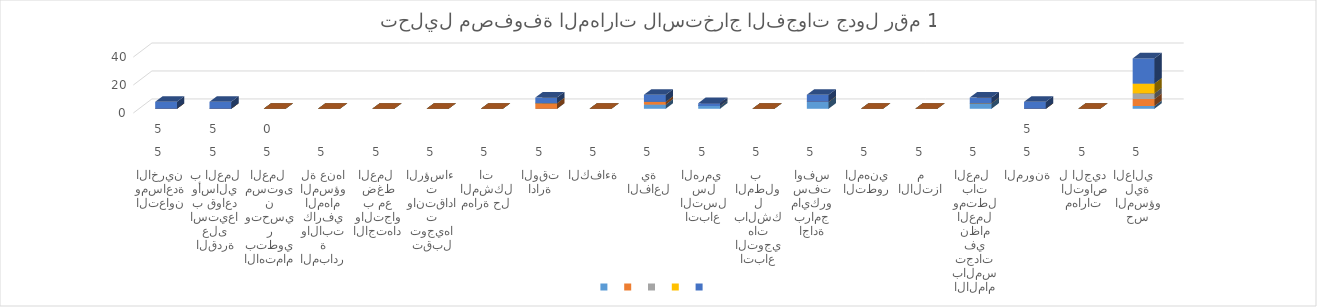
| Category |   |
|---|---|
| 0 | 5 |
| 1 | 5 |
| 2 | 0 |
| 3 | 0 |
| 4 | 0 |
| 5 | 0 |
| 6 | 0 |
| 7 | 4 |
| 8 | 0 |
| 9 | 5 |
| 10 | 2 |
| 11 | 0 |
| 12 | 5 |
| 13 | 0 |
| 14 | 0 |
| 15 | 4 |
| 16 | 5 |
| 17 | 0 |
| 18 | 18 |